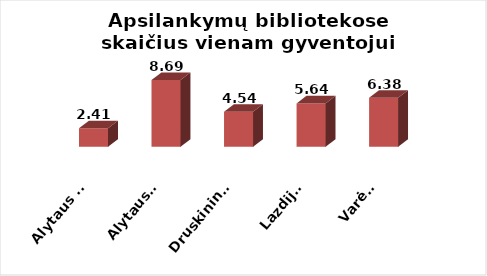
| Category | Series 0 |
|---|---|
| Alytaus m. | 2.406 |
| Alytaus r. | 8.692 |
| Druskininkai | 4.544 |
| Lazdijai | 5.639 |
| Varėna | 6.377 |